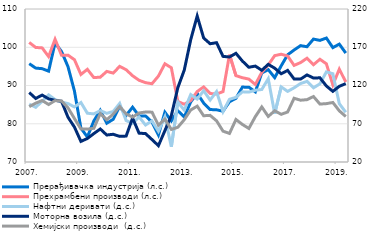
| Category | Прерађивачка индустрија (л.с.) | Прехрамбени производи (л.с.) |
|---|---|---|
| 2007. | 95.7 | 101.256 |
| II | 94.557 | 99.947 |
| III | 94.397 | 99.832 |
| IV | 93.75 | 97.567 |
| 2008. | 101.114 | 102.082 |
| II | 98.886 | 97.918 |
| III | 94.936 | 97.94 |
| IV | 88.543 | 96.738 |
| 2009. | 78.855 | 92.888 |
| II | 76.546 | 94.227 |
| III | 80.733 | 92.069 |
| IV | 83.517 | 92.174 |
| 2010. | 80.138 | 93.684 |
| II | 81.159 | 93.25 |
| III | 84.526 | 95.007 |
| IV | 82.197 | 94.124 |
| 2011. | 84.33 | 92.55 |
| II | 82.035 | 91.361 |
| III | 82.047 | 90.746 |
| IV | 80.46 | 90.461 |
| 2012. | 77.088 | 92.462 |
| II | 83.018 | 95.684 |
| III | 80.739 | 94.635 |
| IV | 83.405 | 85.832 |
| 2013. | 81.793 | 85.107 |
| II | 85.721 | 86.046 |
| III | 87.953 | 88.422 |
| IV | 85.407 | 89.622 |
| 2014. | 83.717 | 87.914 |
| II | 83.644 | 87.76 |
| III | 83.28 | 88.41 |
| IV | 85.765 | 98.069 |
| 2015. | 86.647 | 92.573 |
| II | 89.58 | 92.032 |
| III | 89.56 | 91.674 |
| IV | 88.339 | 90.265 |
| 2016. | 93.289 | 93.441 |
| II | 94.148 | 95.366 |
| III | 92.054 | 97.808 |
| IV | 95.126 | 98.175 |
| 2017. | 98.032 | 97.717 |
| II | 99.276 | 95.255 |
| III | 100.419 | 95.991 |
| IV | 100.137 | 97.137 |
| 2018. | 102.136 | 95.441 |
| II | 101.797 | 96.855 |
| III | 102.407 | 95.669 |
| IV | 99.902 | 90.148 |
| 2019. | 100.816 | 94.279 |
| II | 98.481 | 90.916 |